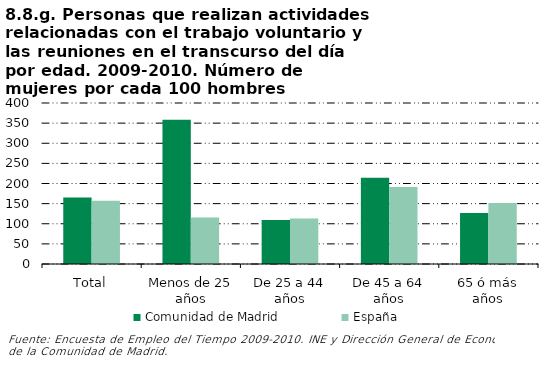
| Category | Comunidad de Madrid | España |
|---|---|---|
| Total | 165.455 | 157.447 |
| Menos de 25 años | 358.121 | 115.686 |
| De 25 a 44 años | 109.161 | 113.158 |
| De 45 a 64 años | 214.14 | 191.429 |
| 65 ó más años | 126.405 | 151.534 |